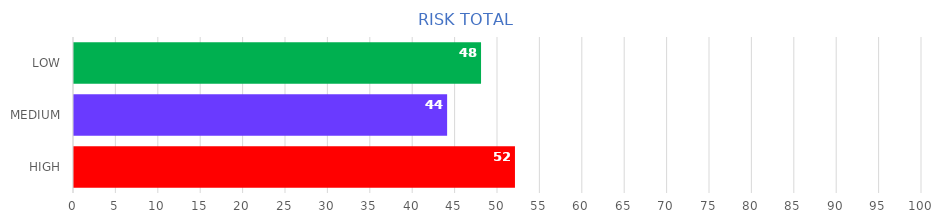
| Category | Series 1 | Series 0 |
|---|---|---|
| HIGH | 52 | 52 |
| MEDIUM | 44 | 44 |
| LOW | 48 | 48 |